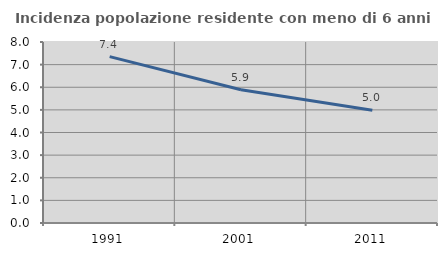
| Category | Incidenza popolazione residente con meno di 6 anni |
|---|---|
| 1991.0 | 7.355 |
| 2001.0 | 5.888 |
| 2011.0 | 4.985 |